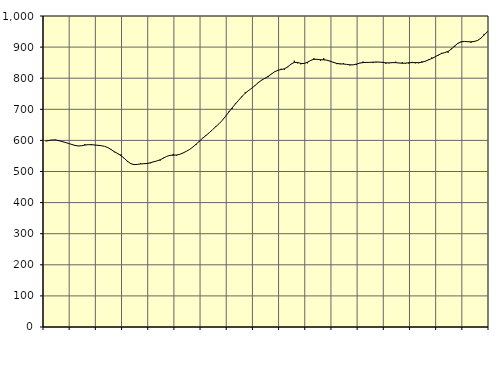
| Category | Piggar | Series 1 |
|---|---|---|
| nan | 598.3 | 597.73 |
| 87.0 | 599.3 | 599.8 |
| 87.0 | 601.6 | 601.44 |
| 87.0 | 602.3 | 601.44 |
| nan | 597.8 | 599.35 |
| 88.0 | 597.2 | 596.42 |
| 88.0 | 592.2 | 593.41 |
| 88.0 | 589.8 | 590.28 |
| nan | 586.1 | 586.9 |
| 89.0 | 583.1 | 583.73 |
| 89.0 | 581.6 | 582.11 |
| 89.0 | 582.5 | 582.89 |
| nan | 587.6 | 584.95 |
| 90.0 | 586.4 | 586.24 |
| 90.0 | 588 | 586.08 |
| 90.0 | 584.8 | 585.22 |
| nan | 584.7 | 584.22 |
| 91.0 | 583.3 | 582.96 |
| 91.0 | 580.8 | 580.83 |
| 91.0 | 576.3 | 576.88 |
| nan | 569.7 | 570.65 |
| 92.0 | 561.8 | 563.82 |
| 92.0 | 556.4 | 557.83 |
| 92.0 | 554.6 | 551.25 |
| nan | 543.5 | 542.61 |
| 93.0 | 530.5 | 532.94 |
| 93.0 | 526.5 | 525.47 |
| 93.0 | 521.6 | 522.25 |
| nan | 523.3 | 522.67 |
| 94.0 | 526.2 | 524.27 |
| 94.0 | 524.9 | 525.11 |
| 94.0 | 524.2 | 525.85 |
| nan | 526.4 | 528.05 |
| 95.0 | 532 | 531.08 |
| 95.0 | 533.9 | 533.89 |
| 95.0 | 535 | 537.7 |
| nan | 544.2 | 543.05 |
| 96.0 | 548.7 | 548.61 |
| 96.0 | 551.6 | 551.94 |
| 96.0 | 556.6 | 552.55 |
| nan | 551.3 | 552.97 |
| 97.0 | 555.7 | 555.3 |
| 97.0 | 559.3 | 559.68 |
| 97.0 | 565.2 | 564.92 |
| nan | 570.7 | 570.93 |
| 98.0 | 578.9 | 578.72 |
| 98.0 | 585.7 | 587.91 |
| 98.0 | 595.9 | 597.51 |
| nan | 608.1 | 607.21 |
| 99.0 | 614.5 | 615.82 |
| 99.0 | 624.8 | 624.74 |
| 99.0 | 634.4 | 634.42 |
| nan | 645.5 | 644.03 |
| 0.0 | 653.7 | 653.53 |
| 0.0 | 664.4 | 664.64 |
| 0.0 | 678.5 | 677.67 |
| nan | 692.6 | 691.25 |
| 1.0 | 701.7 | 704.56 |
| 1.0 | 719 | 717.16 |
| 1.0 | 729.4 | 729.34 |
| nan | 739.3 | 741.11 |
| 2.0 | 754.9 | 751.66 |
| 2.0 | 759.1 | 760.25 |
| 2.0 | 767.5 | 767.85 |
| nan | 775.8 | 776.56 |
| 3.0 | 787.8 | 785.9 |
| 3.0 | 794.4 | 793.52 |
| 3.0 | 798.3 | 799.54 |
| nan | 803.2 | 805.87 |
| 4.0 | 814.2 | 813.28 |
| 4.0 | 821.4 | 820.7 |
| 4.0 | 826.4 | 825.61 |
| nan | 830.4 | 827.93 |
| 5.0 | 827.1 | 830.23 |
| 5.0 | 835.4 | 836.47 |
| 5.0 | 845.8 | 845.36 |
| nan | 856.2 | 850.79 |
| 6.0 | 847.8 | 850.47 |
| 6.0 | 844.7 | 847.64 |
| 6.0 | 847.8 | 847.23 |
| nan | 847.9 | 851.25 |
| 7.0 | 858.4 | 857.22 |
| 7.0 | 864 | 860.79 |
| 7.0 | 859.5 | 860.62 |
| nan | 856.5 | 859.51 |
| 8.0 | 864 | 859.17 |
| 8.0 | 858.4 | 857.94 |
| 8.0 | 853.3 | 854.61 |
| nan | 852.3 | 850.62 |
| 9.0 | 845.2 | 847.44 |
| 9.0 | 844.9 | 846.14 |
| 9.0 | 848.2 | 845.55 |
| nan | 844.4 | 844.45 |
| 10.0 | 841.2 | 842.96 |
| 10.0 | 843.2 | 842.88 |
| 10.0 | 842.2 | 845.38 |
| nan | 849.2 | 848.45 |
| 11.0 | 853.5 | 850.21 |
| 11.0 | 849.5 | 850.63 |
| 11.0 | 851.4 | 850.84 |
| nan | 848.7 | 851.53 |
| 12.0 | 850.9 | 852.08 |
| 12.0 | 851.1 | 851.96 |
| 12.0 | 852.3 | 850.78 |
| nan | 846.9 | 849.38 |
| 13.0 | 847.9 | 849.31 |
| 13.0 | 851.7 | 850.09 |
| 13.0 | 853 | 849.99 |
| nan | 849.1 | 848.91 |
| 14.0 | 851.4 | 848.03 |
| 14.0 | 847.2 | 848.46 |
| 14.0 | 847 | 849.72 |
| nan | 852.5 | 850.27 |
| 15.0 | 847.9 | 850.02 |
| 15.0 | 848 | 849.88 |
| 15.0 | 854.1 | 851.38 |
| nan | 853.8 | 854.58 |
| 16.0 | 860 | 858.7 |
| 16.0 | 866.8 | 863.29 |
| 16.0 | 868.7 | 868.48 |
| nan | 873.1 | 874.46 |
| 17.0 | 881.4 | 879.34 |
| 17.0 | 882.9 | 882.41 |
| 17.0 | 882.1 | 886.05 |
| nan | 895.9 | 893.6 |
| 18.0 | 900.9 | 903.64 |
| 18.0 | 910.7 | 912.17 |
| 18.0 | 915.6 | 917.08 |
| nan | 917.8 | 918.22 |
| 19.0 | 917.9 | 917.3 |
| 19.0 | 914.4 | 916.84 |
| 19.0 | 919.4 | 918.04 |
| nan | 920.6 | 921.35 |
| 20.0 | 927.6 | 928.32 |
| 20.0 | 942.2 | 938.82 |
| 20.0 | 950.3 | 949.33 |